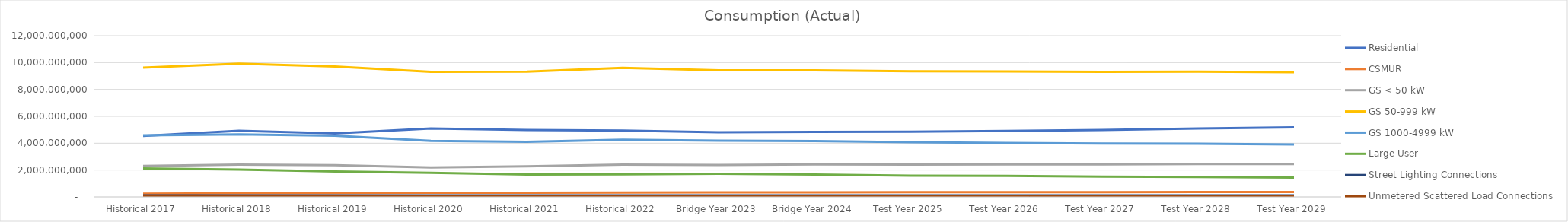
| Category | Residential | CSMUR | GS < 50 kW | GS 50-999 kW | GS 1000-4999 kW | Large User | Street Lighting Connections | Unmetered Scattered Load Connections |
|---|---|---|---|---|---|---|---|---|
| Historical 2017 | 4545714645.058 | 245275380.627 | 2311840421.205 | 9622771102.772 | 4589196039.663 | 2127297945.727 | 115072180.635 | 41404515.489 |
| Historical 2018 | 4927526992.47 | 270836212.458 | 2404335418.466 | 9921831646.948 | 4656922360.701 | 2034120650.822 | 115403896.655 | 40477714.494 |
| Historical 2019 | 4729458671.443 | 277567648.594 | 2367473347.343 | 9711872547.182 | 4554372184.119 | 1896701615.242 | 115091255.126 | 40395663.34 |
| Historical 2020 | 5094828703.168 | 305026830.932 | 2190514000.598 | 9311631673.886 | 4174985520.424 | 1791431051.686 | 115311511.878 | 40389262.893 |
| Historical 2021 | 4976366980.86 | 316584976.336 | 2279331264.239 | 9330978840.66 | 4104076189.941 | 1662798981 | 115326732.801 | 41586125.274 |
| Historical 2022 | 4941071680.996 | 328137410.724 | 2403616498.847 | 9607262360.813 | 4255863824.551 | 1688947009.12 | 118535643.066 | 41993718.68 |
| Bridge Year 2023 | 4806829158.818 | 333093467.345 | 2373072715.691 | 9429889264.855 | 4183723222.321 | 1731139897.579 | 118704995.437 | 41993718.68 |
| Bridge Year 2024 | 4837993116.307 | 340865892.486 | 2414079624.219 | 9428743227.005 | 4166444827.405 | 1662857470.316 | 119245168.889 | 42108769.964 |
| Test Year 2025 | 4855700377.091 | 347069183.044 | 2410426638.696 | 9360445528.305 | 4080129425.802 | 1584083221.578 | 119021063.232 | 41993718.68 |
| Test Year 2026 | 4906312992.09 | 354231916.457 | 2412867868.483 | 9333302390.558 | 4019512930.819 | 1569599717.824 | 119179097.129 | 41993718.68 |
| Test Year 2027 | 4981019411.159 | 360733976.648 | 2420548489.755 | 9309924735.332 | 3975239927.116 | 1520893431.951 | 119337131.027 | 41993718.68 |
| Test Year 2028 | 5089976990.159 | 367510992.812 | 2448336845.762 | 9320742543.763 | 3963765471.591 | 1482340317.196 | 119879337.796 | 42108769.964 |
| Test Year 2029 | 5181381664.831 | 371599182.732 | 2452511140.83 | 9279904610.141 | 3906878118.102 | 1440432090.781 | 119653198.822 | 41993718.68 |